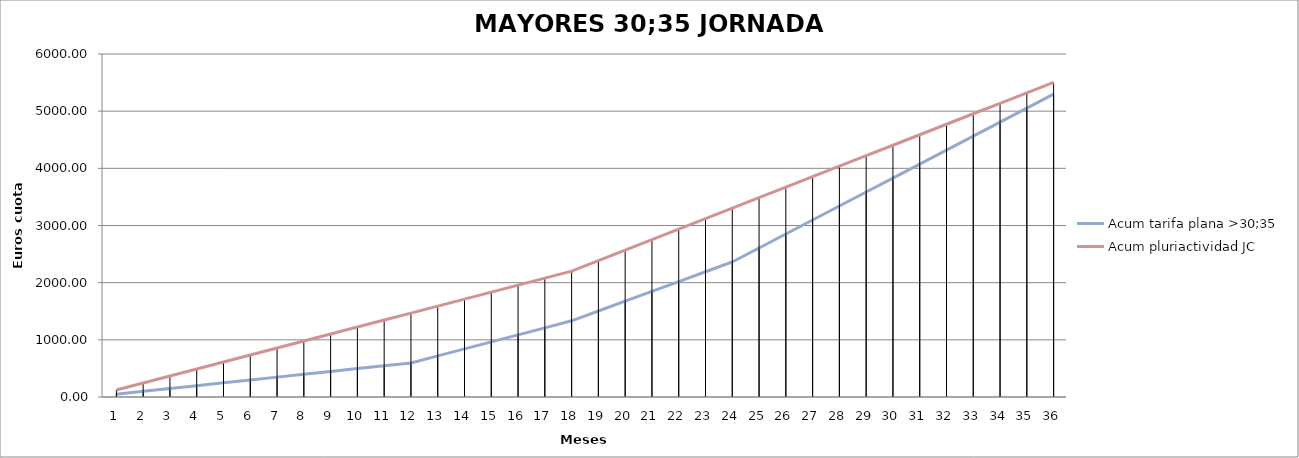
| Category | Acum tarifa plana >30;35 | Acum pluriactividad JC |
|---|---|---|
| 1.0 | 49.669 | 122.333 |
| 2.0 | 99.338 | 244.667 |
| 3.0 | 149.008 | 367 |
| 4.0 | 198.677 | 489.334 |
| 5.0 | 248.346 | 611.667 |
| 6.0 | 298.015 | 734 |
| 7.0 | 347.684 | 856.334 |
| 8.0 | 397.354 | 978.667 |
| 9.0 | 447.023 | 1101.001 |
| 10.0 | 496.692 | 1223.334 |
| 11.0 | 546.361 | 1345.667 |
| 12.0 | 596.03 | 1468.001 |
| 13.0 | 718.824 | 1590.334 |
| 14.0 | 841.617 | 1712.668 |
| 15.0 | 964.41 | 1835.001 |
| 16.0 | 1087.204 | 1957.334 |
| 17.0 | 1209.997 | 2079.668 |
| 18.0 | 1332.79 | 2202.001 |
| 19.0 | 1504.333 | 2385.501 |
| 20.0 | 1675.876 | 2569.001 |
| 21.0 | 1847.418 | 2752.502 |
| 22.0 | 2018.961 | 2936.002 |
| 23.0 | 2190.504 | 3119.502 |
| 24.0 | 2362.046 | 3303.002 |
| 25.0 | 2606.713 | 3486.502 |
| 26.0 | 2851.38 | 3670.002 |
| 27.0 | 3096.047 | 3853.502 |
| 28.0 | 3340.714 | 4037.002 |
| 29.0 | 3585.38 | 4220.502 |
| 30.0 | 3830.047 | 4404.002 |
| 31.0 | 4074.714 | 4587.503 |
| 32.0 | 4319.381 | 4771.003 |
| 33.0 | 4564.048 | 4954.503 |
| 34.0 | 4808.714 | 5138.003 |
| 35.0 | 5053.381 | 5321.503 |
| 36.0 | 5298.048 | 5505.003 |